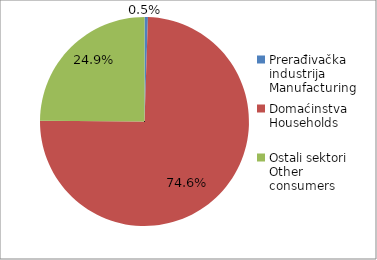
| Category | Series 0 |
|---|---|
| Prerađivačka industrija Manufacturing | 21 |
| Domaćinstva Households | 2965 |
| Ostali sektori Other consumers | 989 |